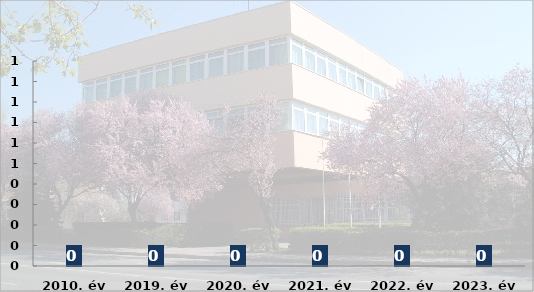
| Category | Embercsempészés bűncselekmények száma |
|---|---|
| 2010. év | 0 |
| 2019. év | 0 |
| 2020. év | 0 |
| 2021. év | 0 |
| 2022. év | 0 |
| 2023. év | 0 |